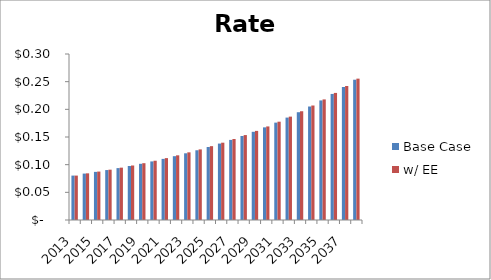
| Category | Base Case | w/ EE |
|---|---|---|
| 2013.0 | 0.08 | 0.08 |
| 2014.0 | 0.084 | 0.084 |
| 2015.0 | 0.087 | 0.088 |
| 2016.0 | 0.09 | 0.091 |
| 2017.0 | 0.094 | 0.095 |
| 2018.0 | 0.098 | 0.099 |
| 2019.0 | 0.102 | 0.103 |
| 2020.0 | 0.106 | 0.107 |
| 2021.0 | 0.11 | 0.112 |
| 2022.0 | 0.115 | 0.117 |
| 2023.0 | 0.121 | 0.122 |
| 2024.0 | 0.126 | 0.128 |
| 2025.0 | 0.132 | 0.133 |
| 2026.0 | 0.138 | 0.14 |
| 2027.0 | 0.145 | 0.146 |
| 2028.0 | 0.152 | 0.153 |
| 2029.0 | 0.159 | 0.161 |
| 2030.0 | 0.167 | 0.169 |
| 2031.0 | 0.176 | 0.178 |
| 2032.0 | 0.185 | 0.187 |
| 2033.0 | 0.195 | 0.197 |
| 2034.0 | 0.205 | 0.207 |
| 2035.0 | 0.216 | 0.218 |
| 2036.0 | 0.228 | 0.23 |
| 2037.0 | 0.24 | 0.242 |
| 2038.0 | 0.254 | 0.255 |